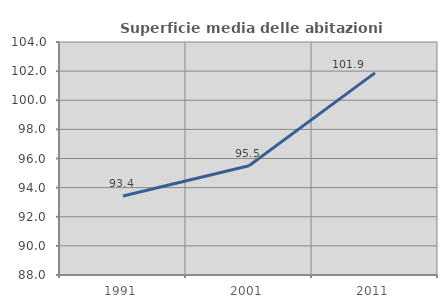
| Category | Superficie media delle abitazioni occupate |
|---|---|
| 1991.0 | 93.419 |
| 2001.0 | 95.5 |
| 2011.0 | 101.882 |